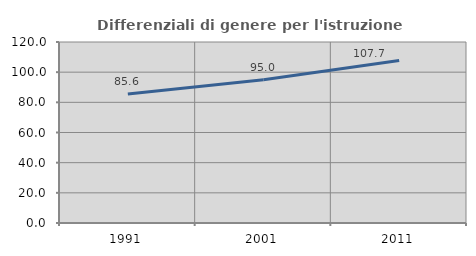
| Category | Differenziali di genere per l'istruzione superiore |
|---|---|
| 1991.0 | 85.6 |
| 2001.0 | 95.006 |
| 2011.0 | 107.708 |